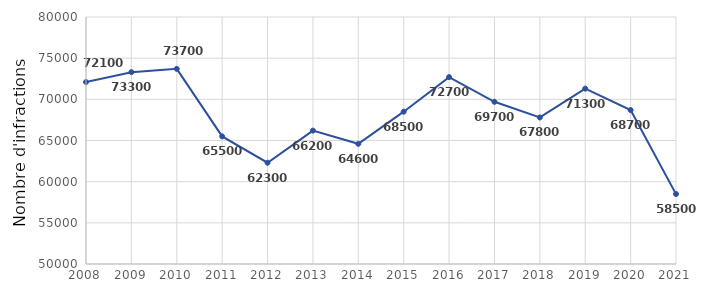
| Category | Series 0 |
|---|---|
| 2008.0 | 72100 |
| 2009.0 | 73300 |
| 2010.0 | 73700 |
| 2011.0 | 65500 |
| 2012.0 | 62300 |
| 2013.0 | 66200 |
| 2014.0 | 64600 |
| 2015.0 | 68500 |
| 2016.0 | 72700 |
| 2017.0 | 69700 |
| 2018.0 | 67800 |
| 2019.0 | 71300 |
| 2020.0 | 68700 |
| 2021.0 | 58500 |